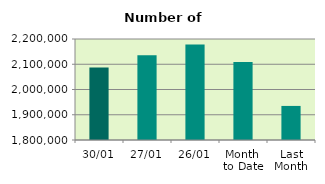
| Category | Series 0 |
|---|---|
| 30/01 | 2087076 |
| 27/01 | 2135236 |
| 26/01 | 2178430 |
| Month 
to Date | 2108880.857 |
| Last
Month | 1934937.048 |